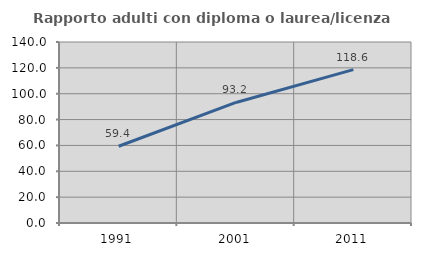
| Category | Rapporto adulti con diploma o laurea/licenza media  |
|---|---|
| 1991.0 | 59.375 |
| 2001.0 | 93.247 |
| 2011.0 | 118.646 |